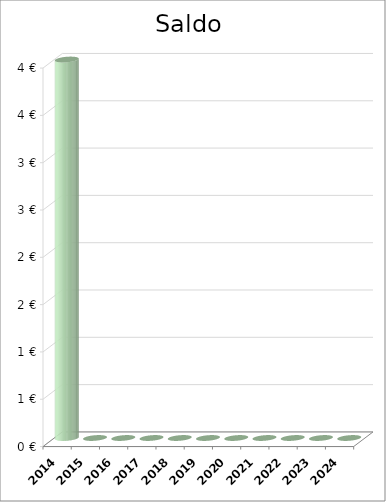
| Category | Saldo |
|---|---|
| 2014.0 | 4 |
| 2015.0 | 0 |
| 2016.0 | 0 |
| 2017.0 | 0 |
| 2018.0 | 0 |
| 2019.0 | 0 |
| 2020.0 | 0 |
| 2021.0 | 0 |
| 2022.0 | 0 |
| 2023.0 | 0 |
| 2024.0 | 0 |